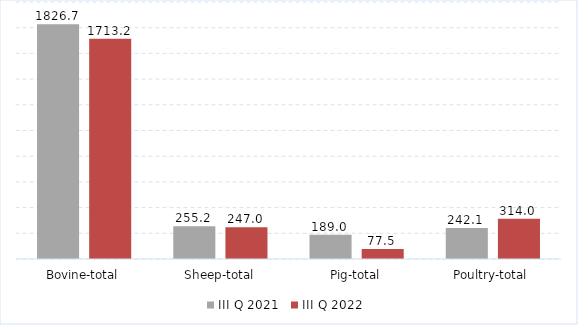
| Category | III Q 2021 | III Q 2022 |
|---|---|---|
| Bovine-total | 1826.695 | 1713.2 |
| Sheep-total | 255.164 | 247 |
| Pig-total | 188.995 | 77.5 |
| Poultry-total | 242.111 | 314 |